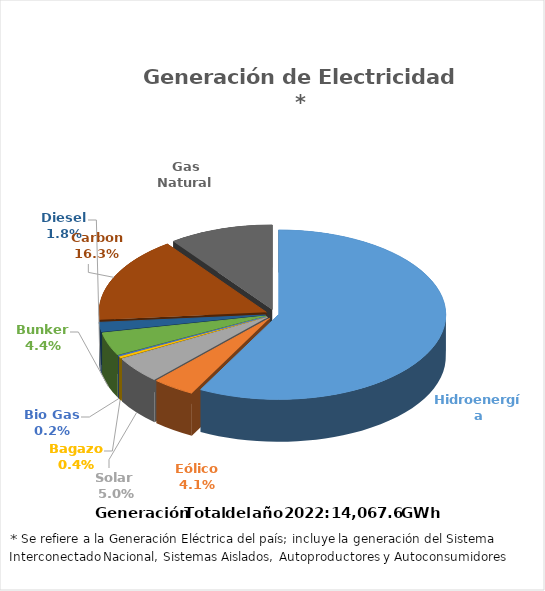
| Category | Series 0 |
|---|---|
| Hidroenergía | 8117.426 |
| Eólico | 579.266 |
| Solar  | 703.041 |
| Bagazo | 52.59 |
| Bio Gas | 21.68 |
| Bunker | 620.237 |
| Diesel | 259.995 |
| Carbon | 2294.689 |
| Gas Natural | 1418.62 |